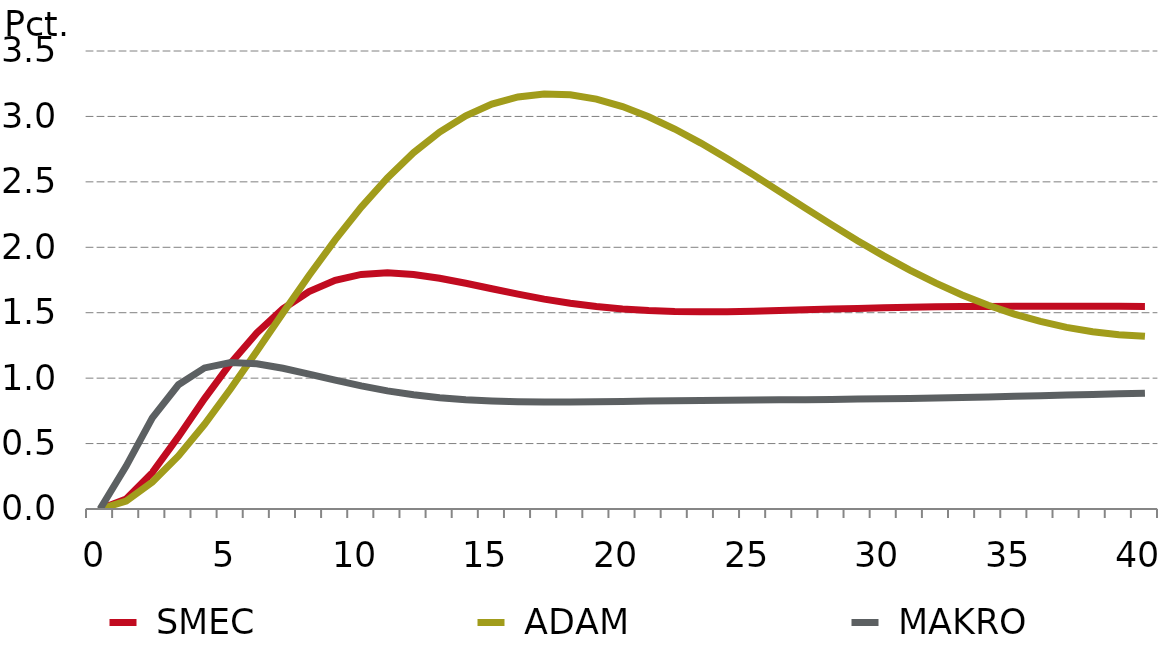
| Category |  SMEC |  ADAM |  MAKRO |
|---|---|---|---|
| 0.0 | 0 | 0 | 0 |
| nan | 0.077 | 0.061 | 0.328 |
| nan | 0.278 | 0.206 | 0.696 |
| nan | 0.553 | 0.406 | 0.95 |
| nan | 0.844 | 0.647 | 1.078 |
| 5.0 | 1.114 | 0.918 | 1.119 |
| nan | 1.346 | 1.206 | 1.11 |
| nan | 1.529 | 1.498 | 1.076 |
| nan | 1.662 | 1.785 | 1.031 |
| nan | 1.748 | 2.057 | 0.984 |
| 10.0 | 1.793 | 2.307 | 0.941 |
| nan | 1.804 | 2.53 | 0.903 |
| nan | 1.792 | 2.722 | 0.872 |
| nan | 1.763 | 2.881 | 0.85 |
| nan | 1.725 | 3.005 | 0.835 |
| 15.0 | 1.683 | 3.094 | 0.825 |
| nan | 1.642 | 3.149 | 0.819 |
| nan | 1.604 | 3.172 | 0.817 |
| nan | 1.572 | 3.166 | 0.818 |
| nan | 1.547 | 3.132 | 0.819 |
| 20.0 | 1.528 | 3.075 | 0.822 |
| nan | 1.516 | 2.998 | 0.825 |
| nan | 1.509 | 2.904 | 0.827 |
| nan | 1.507 | 2.796 | 0.83 |
| nan | 1.508 | 2.679 | 0.832 |
| 25.0 | 1.511 | 2.555 | 0.833 |
| nan | 1.516 | 2.428 | 0.834 |
| nan | 1.522 | 2.299 | 0.836 |
| nan | 1.528 | 2.173 | 0.838 |
| nan | 1.533 | 2.051 | 0.84 |
| 30.0 | 1.538 | 1.934 | 0.842 |
| nan | 1.542 | 1.826 | 0.845 |
| nan | 1.545 | 1.726 | 0.849 |
| nan | 1.547 | 1.636 | 0.853 |
| nan | 1.548 | 1.557 | 0.857 |
| 35.0 | 1.549 | 1.489 | 0.861 |
| nan | 1.549 | 1.433 | 0.866 |
| nan | 1.549 | 1.388 | 0.87 |
| nan | 1.549 | 1.355 | 0.875 |
| nan | 1.549 | 1.332 | 0.88 |
| 40.0 | 1.548 | 1.32 | 0.885 |